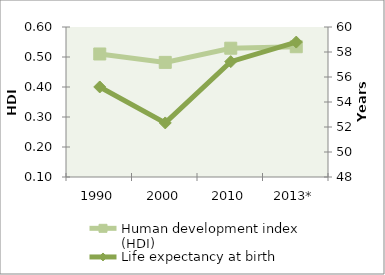
| Category | Human development index (HDI) |
|---|---|
| 1990 | 0.51 |
| 2000 | 0.482 |
| 2010 | 0.529 |
| 2013* | 0.534 |